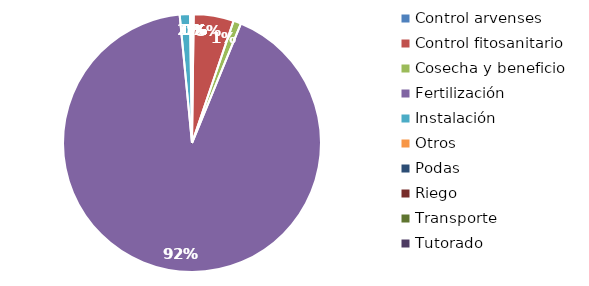
| Category | Valor |
|---|---|
| Control arvenses | 540000 |
| Control fitosanitario | 13008000 |
| Cosecha y beneficio | 2500000 |
| Fertilización | 239215000 |
| Instalación | 3336000 |
| Otros | 630000 |
| Podas | 0 |
| Riego | 0 |
| Transporte | 0 |
| Tutorado | 0 |